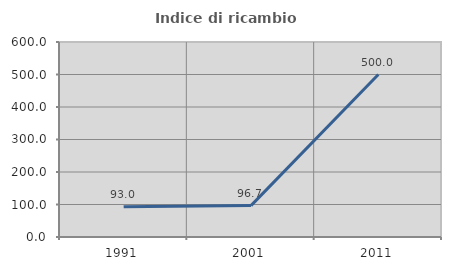
| Category | Indice di ricambio occupazionale  |
|---|---|
| 1991.0 | 93.023 |
| 2001.0 | 96.667 |
| 2011.0 | 500 |